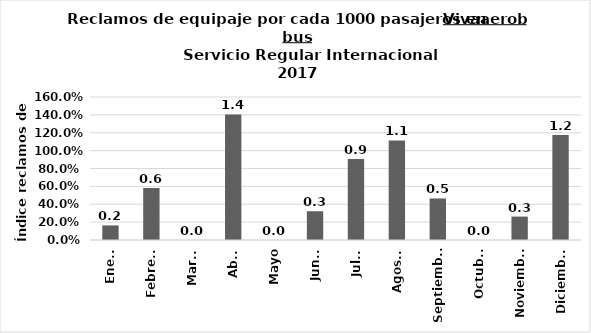
| Category | Reclamos por cada 1000 pasajeros |
|---|---|
| Enero | 0.163 |
| Febrero | 0.583 |
| Marzo | 0 |
| Abril | 1.405 |
| Mayo | 0 |
| Junio | 0.322 |
| Julio | 0.907 |
| Agosto | 1.114 |
| Septiembre | 0.464 |
| Octubre | 0 |
| Noviembre | 0.262 |
| Diciembre | 1.176 |